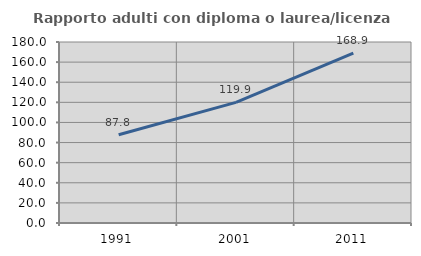
| Category | Rapporto adulti con diploma o laurea/licenza media  |
|---|---|
| 1991.0 | 87.796 |
| 2001.0 | 119.945 |
| 2011.0 | 168.914 |